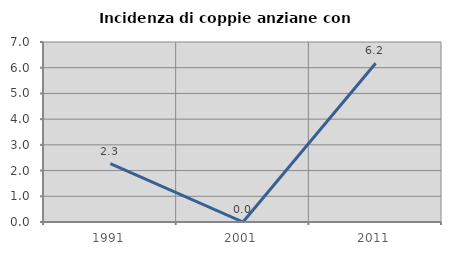
| Category | Incidenza di coppie anziane con figli |
|---|---|
| 1991.0 | 2.273 |
| 2001.0 | 0 |
| 2011.0 | 6.173 |